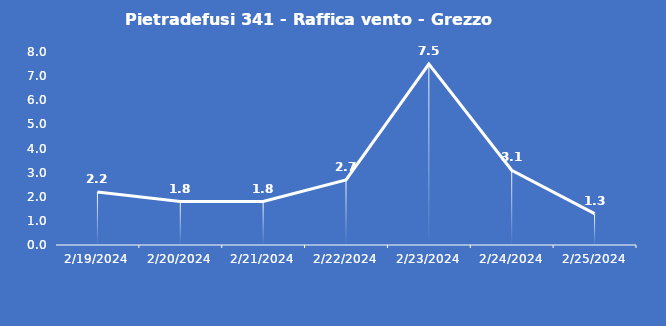
| Category | Pietradefusi 341 - Raffica vento - Grezzo (m/s) |
|---|---|
| 2/19/24 | 2.2 |
| 2/20/24 | 1.8 |
| 2/21/24 | 1.8 |
| 2/22/24 | 2.7 |
| 2/23/24 | 7.5 |
| 2/24/24 | 3.1 |
| 2/25/24 | 1.3 |